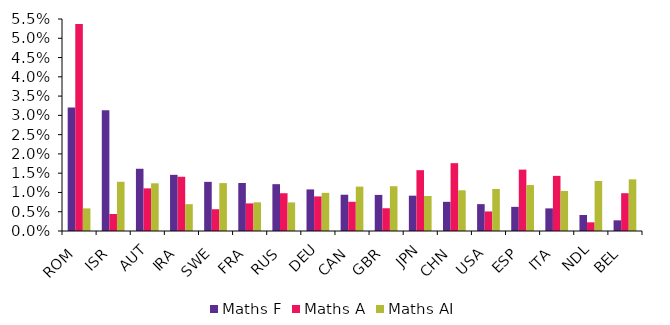
| Category | Maths F | Maths A | Maths AI |
|---|---|---|---|
| ROM | 3.203 | 5.369 | 0.587 |
| ISR | 3.134 | 0.441 | 1.277 |
| AUT | 1.615 | 1.106 | 1.237 |
| IRA | 1.457 | 1.407 | 0.696 |
| SWE | 1.275 | 0.565 | 1.243 |
| FRA | 1.245 | 0.716 | 0.744 |
| RUS | 1.215 | 0.98 | 0.741 |
| DEU | 1.079 | 0.897 | 0.989 |
| CAN | 0.941 | 0.758 | 1.151 |
| GBR | 0.937 | 0.59 | 1.161 |
| JPN | 0.917 | 1.578 | 0.908 |
| CHN | 0.757 | 1.76 | 1.056 |
| USA | 0.697 | 0.508 | 1.09 |
| ESP | 0.626 | 1.593 | 1.193 |
| ITA | 0.587 | 1.43 | 1.04 |
| NDL | 0.416 | 0.225 | 1.297 |
| BEL | 0.277 | 0.981 | 1.34 |